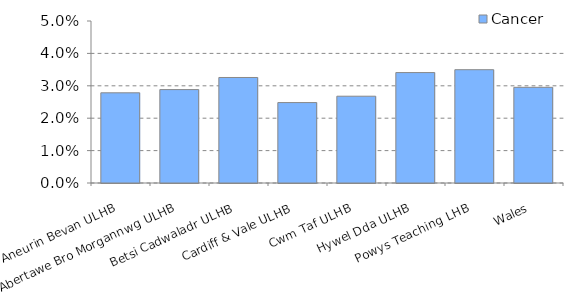
| Category | Cancer |
|---|---|
| Aneurin Bevan ULHB | 0.028 |
| Abertawe Bro Morgannwg ULHB | 0.029 |
| Betsi Cadwaladr ULHB | 0.033 |
| Cardiff & Vale ULHB | 0.025 |
| Cwm Taf ULHB | 0.027 |
| Hywel Dda ULHB | 0.034 |
| Powys Teaching LHB | 0.035 |
| Wales | 0.03 |